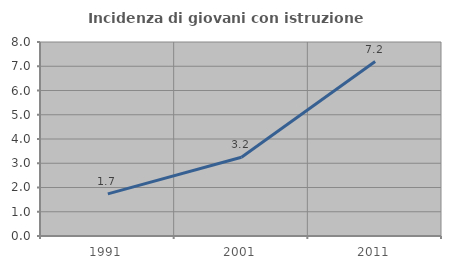
| Category | Incidenza di giovani con istruzione universitaria |
|---|---|
| 1991.0 | 1.739 |
| 2001.0 | 3.247 |
| 2011.0 | 7.194 |